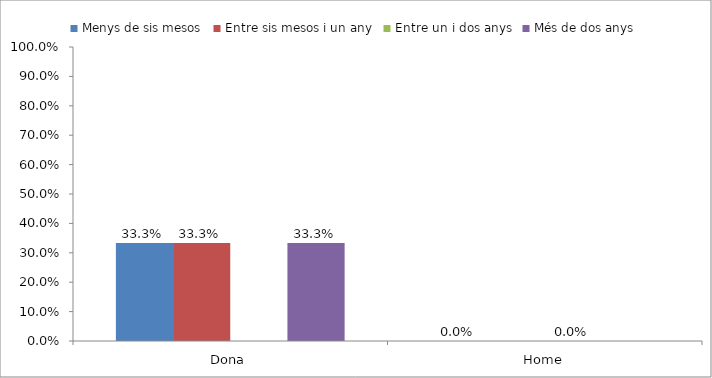
| Category | Menys de sis mesos | Entre sis mesos i un any | Entre un i dos anys | Més de dos anys |
|---|---|---|---|---|
| Dona | 0.333 | 0.333 | 0 | 0.333 |
| Home | 0 | 0 | 0 | 0 |